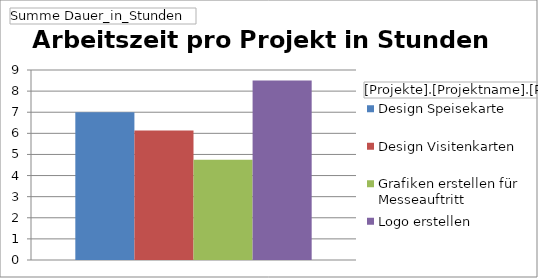
| Category | Design Speisekarte | Design Visitenkarten | Grafiken erstellen für Messeauftritt | Logo erstellen |
|---|---|---|---|---|
| Ergebnis | 7 | 6.133 | 4.75 | 8.5 |